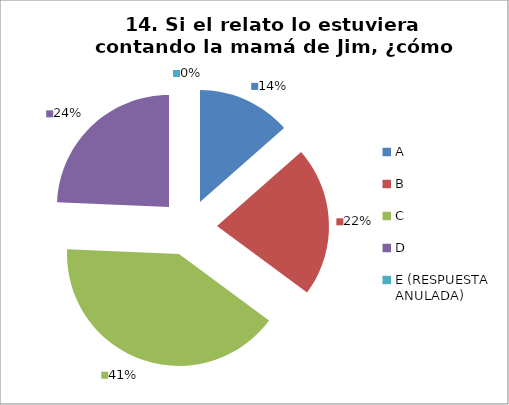
| Category | CANTIDAD DE RESPUESTAS PREGUNTA (14) | PORCENTAJE |
|---|---|---|
| A | 5 | 0.135 |
| B | 8 | 0.216 |
| C | 15 | 0.405 |
| D | 9 | 0.243 |
| E (RESPUESTA ANULADA) | 0 | 0 |